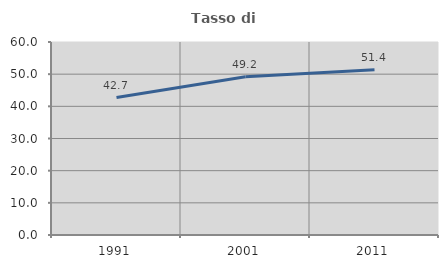
| Category | Tasso di occupazione   |
|---|---|
| 1991.0 | 42.715 |
| 2001.0 | 49.198 |
| 2011.0 | 51.39 |